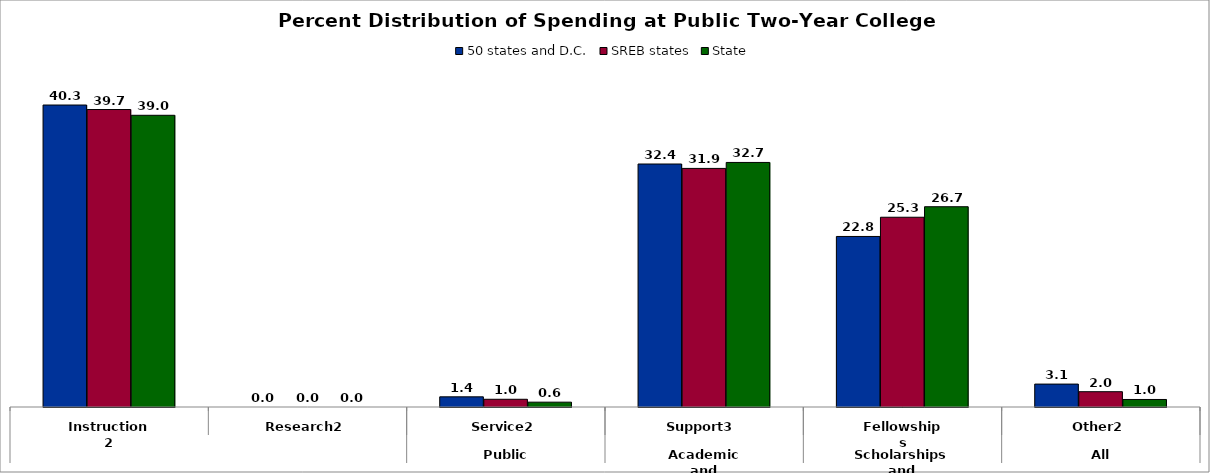
| Category | 50 states and D.C. | SREB states | State |
|---|---|---|---|
| 0 | 40.323 | 39.722 | 38.952 |
| 1 | 0 | 0 | 0 |
| 2 | 1.357 | 1.032 | 0.645 |
| 3 | 32.446 | 31.859 | 32.655 |
| 4 | 22.772 | 25.338 | 26.742 |
| 5 | 3.059 | 2.044 | 1.005 |